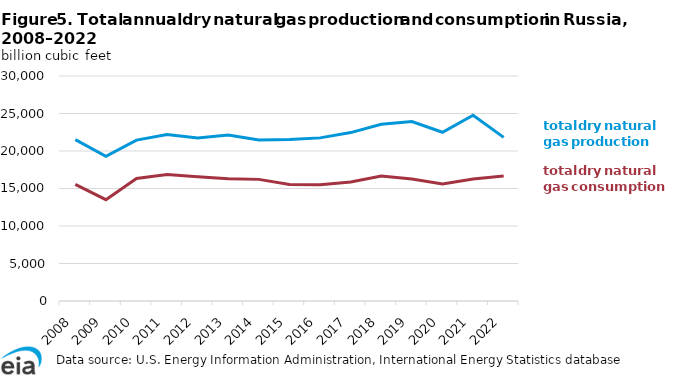
| Category | dry natural gas production | dry natural gas consumption |
|---|---|---|
| 2008.0 | 21515 | 15545.663 |
| 2009.0 | 19303 | 13504.809 |
| 2010.0 | 21457.747 | 16333.541 |
| 2011.0 | 22208.191 | 16872.094 |
| 2012.0 | 21742.033 | 16561.322 |
| 2013.0 | 22139.327 | 16308.82 |
| 2014.0 | 21468.342 | 16217.001 |
| 2015.0 | 21531.202 | 15538.247 |
| 2016.0 | 21750.048 | 15490.713 |
| 2017.0 | 22452.939 | 15857.965 |
| 2018.0 | 23575.586 | 16676.968 |
| 2019.0 | 23937.637 | 16280.466 |
| 2020.0 | 22500.807 | 15614.214 |
| 2021.0 | 24774.84 | 16280.466 |
| 2022.0 | 21818.464 | 16676.968 |